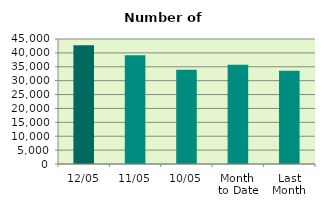
| Category | Series 0 |
|---|---|
| 12/05 | 42752 |
| 11/05 | 39122 |
| 10/05 | 33916 |
| Month 
to Date | 35766.222 |
| Last
Month | 33588.111 |